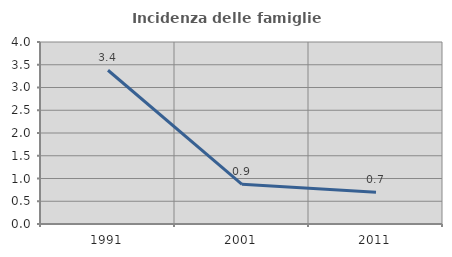
| Category | Incidenza delle famiglie numerose |
|---|---|
| 1991.0 | 3.379 |
| 2001.0 | 0.873 |
| 2011.0 | 0.699 |